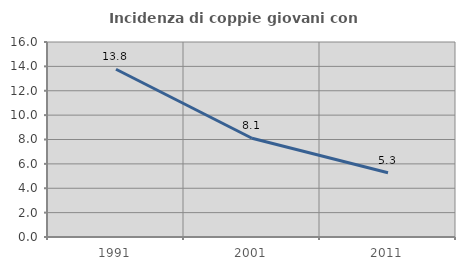
| Category | Incidenza di coppie giovani con figli |
|---|---|
| 1991.0 | 13.762 |
| 2001.0 | 8.102 |
| 2011.0 | 5.271 |